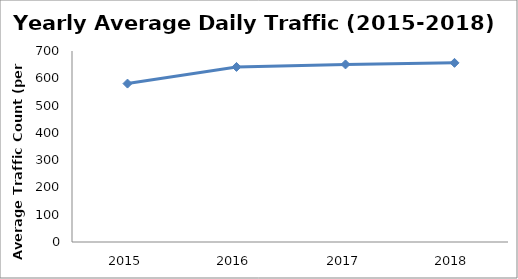
| Category | Series 0 |
|---|---|
| 2015.0 | 580.559 |
| 2016.0 | 641.552 |
| 2017.0 | 650.762 |
| 2018.0 | 656.589 |